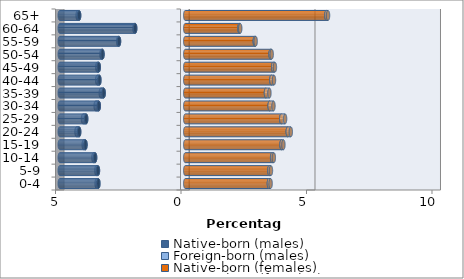
| Category | Native-born (males) | Foreign-born (males) | Native-born (females) | Foreign-born (females) |
|---|---|---|---|---|
| 0-4 | -3.462 | -0.069 | 3.332 | 0.068 |
| 5-9 | -3.478 | -0.064 | 3.35 | 0.064 |
| 10-14 | -3.591 | -0.068 | 3.461 | 0.069 |
| 15-19 | -3.975 | -0.072 | 3.835 | 0.076 |
| 20-24 | -4.226 | -0.107 | 4.083 | 0.122 |
| 25-29 | -3.947 | -0.128 | 3.824 | 0.153 |
| 30-34 | -3.444 | -0.126 | 3.362 | 0.152 |
| 35-39 | -3.25 | -0.116 | 3.215 | 0.138 |
| 40-44 | -3.42 | -0.089 | 3.43 | 0.105 |
| 45-49 | -3.446 | -0.06 | 3.504 | 0.069 |
| 50-54 | -3.296 | -0.042 | 3.398 | 0.046 |
| 55-59 | -2.639 | -0.034 | 2.77 | 0.035 |
| 60-64 | -1.994 | -0.03 | 2.159 | 0.032 |
| 65+ | -4.228 | -0.06 | 5.622 | 0.067 |